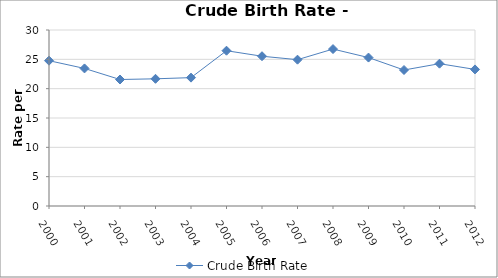
| Category | Crude Birth Rate |
|---|---|
| 2000.0 | 24.77 |
| 2001.0 | 23.45 |
| 2002.0 | 21.56 |
| 2003.0 | 21.68 |
| 2004.0 | 21.88 |
| 2005.0 | 26.47 |
| 2006.0 | 25.53 |
| 2007.0 | 24.94 |
| 2008.0 | 26.75 |
| 2009.0 | 25.3 |
| 2010.0 | 23.18 |
| 2011.0 | 24.26 |
| 2012.0 | 23.28 |